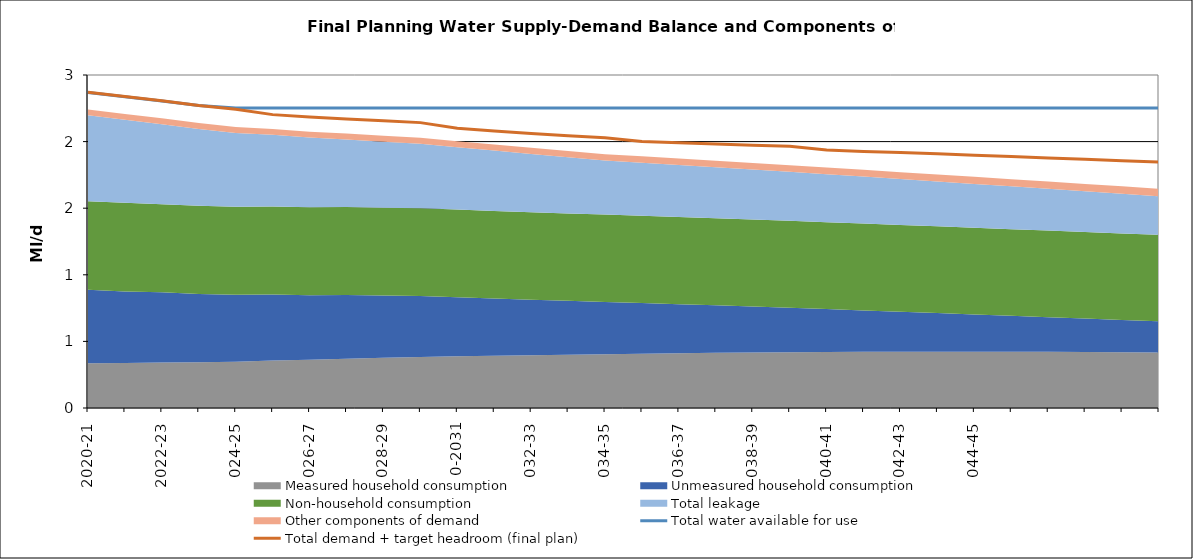
| Category | Total water available for use | Total demand + target headroom (final plan) |
|---|---|---|
| 2020-21 | 2.369 | 2.37 |
| 2021-22 | 2.337 | 2.339 |
| 2022-23 | 2.304 | 2.307 |
| 2023-24 | 2.27 | 2.271 |
| 2024-25 | 2.253 | 2.244 |
| 2025-26 | 2.253 | 2.202 |
| 2026-27 | 2.253 | 2.184 |
| 2027-28 | 2.253 | 2.17 |
| 2028-29 | 2.253 | 2.156 |
| 2029-30 | 2.253 | 2.142 |
| 2030-31 | 2.253 | 2.1 |
| 2031-32 | 2.253 | 2.08 |
| 2032-33 | 2.253 | 2.061 |
| 2033-34 | 2.253 | 2.044 |
| 2034-35 | 2.253 | 2.028 |
| 2035-36 | 2.253 | 2.001 |
| 2036-37 | 2.253 | 1.992 |
| 2037-38 | 2.253 | 1.982 |
| 2038-39 | 2.253 | 1.973 |
| 2039-40 | 2.253 | 1.965 |
| 2040-41 | 2.253 | 1.937 |
| 2041-42 | 2.253 | 1.927 |
| 2042-43 | 2.253 | 1.918 |
| 2043-44 | 2.253 | 1.909 |
| 2044-45 | 2.253 | 1.898 |
| 2045-46 | 2.253 | 1.887 |
| 2046-47 | 2.253 | 1.876 |
| 2047-48 | 2.253 | 1.867 |
| 2048-49 | 2.253 | 1.855 |
| 2049-50 | 2.253 | 1.847 |